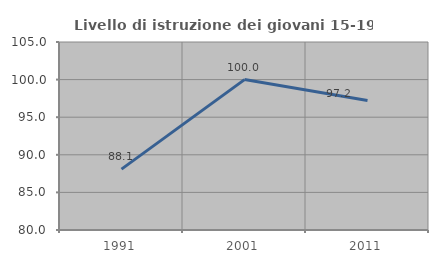
| Category | Livello di istruzione dei giovani 15-19 anni |
|---|---|
| 1991.0 | 88.095 |
| 2001.0 | 100 |
| 2011.0 | 97.222 |